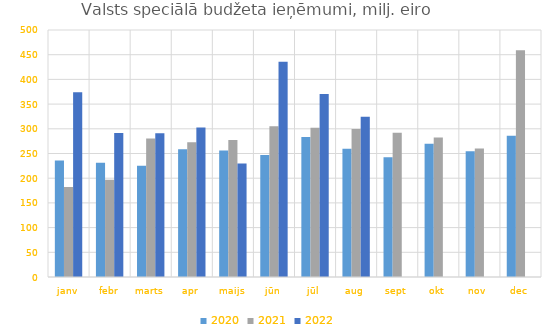
| Category | 2020 | 2021 | 2022 |
|---|---|---|---|
| janv | 235581.606 | 182213.528 | 373920.799 |
| febr | 231251.664 | 196739.364 | 291303.596 |
| marts | 225206.856 | 280261.929 | 290859.027 |
| apr | 258832.404 | 272916.721 | 302459.796 |
| maijs | 256203.758 | 277554.305 | 229777.32 |
| jūn | 247189.712 | 304993.499 | 435953.091 |
| jūl | 283516.218 | 302140.072 | 370694.27 |
| aug | 259698.416 | 299731.991 | 324382.079 |
| sept | 242624.019 | 292093.132 | 0 |
| okt | 269550.251 | 282344.858 | 0 |
| nov | 254562.176 | 260178.761 | 0 |
| dec | 286098.933 | 458943.507 | 0 |